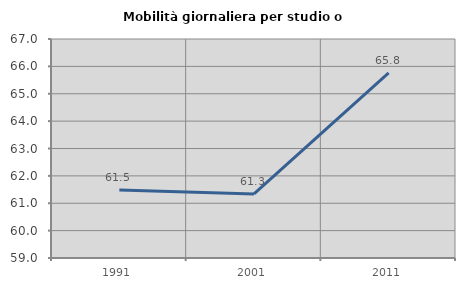
| Category | Mobilità giornaliera per studio o lavoro |
|---|---|
| 1991.0 | 61.485 |
| 2001.0 | 61.342 |
| 2011.0 | 65.76 |